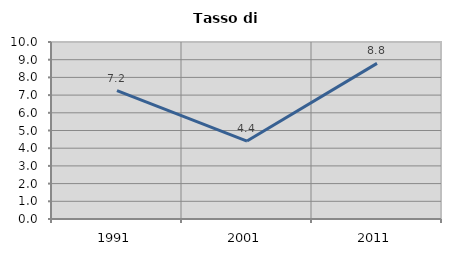
| Category | Tasso di disoccupazione   |
|---|---|
| 1991.0 | 7.248 |
| 2001.0 | 4.402 |
| 2011.0 | 8.793 |